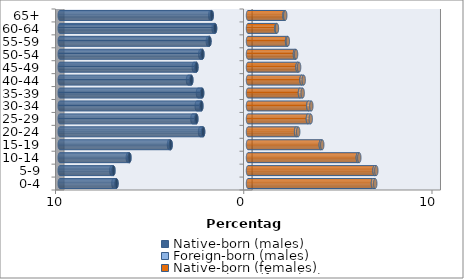
| Category | Native-born (males) | Foreign-born (males) | Native-born (females) | Foreign-born (females) |
|---|---|---|---|---|
| 0-4 | -6.988 | -0.161 | 6.638 | 0.122 |
| 5-9 | -7.15 | -0.11 | 6.722 | 0.095 |
| 10-14 | -6.3 | -0.084 | 5.837 | 0.076 |
| 15-19 | -4.111 | -0.085 | 3.868 | 0.076 |
| 20-24 | -2.384 | -0.161 | 2.555 | 0.112 |
| 25-29 | -2.745 | -0.207 | 3.182 | 0.15 |
| 30-34 | -2.478 | -0.245 | 3.205 | 0.16 |
| 35-39 | -2.436 | -0.222 | 2.761 | 0.144 |
| 40-44 | -3.011 | -0.175 | 2.846 | 0.114 |
| 45-49 | -2.74 | -0.139 | 2.633 | 0.082 |
| 50-54 | -2.424 | -0.11 | 2.495 | 0.059 |
| 55-59 | -2.048 | -0.085 | 2.075 | 0.042 |
| 60-64 | -1.75 | -0.076 | 1.51 | 0.027 |
| 65+ | -1.928 | -0.078 | 1.938 | 0.042 |